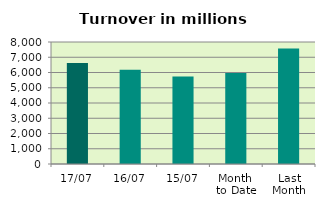
| Category | Series 0 |
|---|---|
| 17/07 | 6627.221 |
| 16/07 | 6184.542 |
| 15/07 | 5735.047 |
| Month 
to Date | 5969.008 |
| Last
Month | 7579.876 |